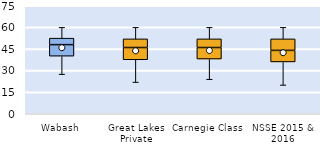
| Category | 25th | 50th | 75th |
|---|---|---|---|
| Wabash | 40 | 8 | 4.5 |
| Great Lakes Private | 37.5 | 8.5 | 6 |
| Carnegie Class | 38 | 8 | 6 |
| NSSE 2015 & 2016 | 36 | 8 | 8 |